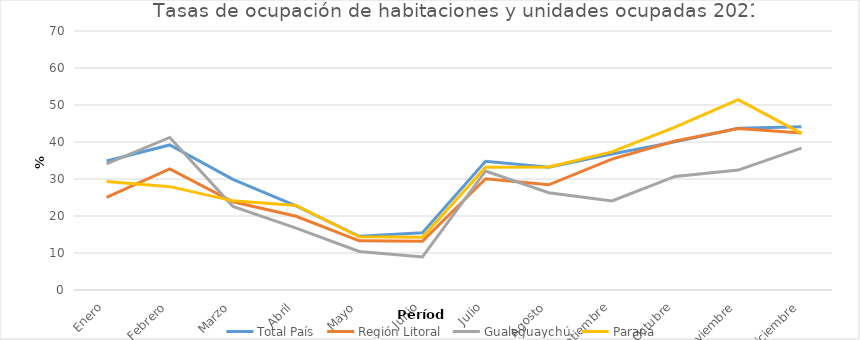
| Category | Total País | Región Litoral | Gualeguaychú | Paraná |
|---|---|---|---|---|
| Enero | 34.859 | 25.038 | 34.062 | 29.308 |
| Febrero | 39.201 | 32.708 | 41.226 | 27.935 |
| Marzo | 29.902 | 23.837 | 22.61 | 24.097 |
| Abril | 22.762 | 19.927 | 16.72 | 22.861 |
| Mayo | 14.509 | 13.28 | 10.406 | 14.374 |
| Junio | 15.469 | 13.162 | 8.916 | 14.261 |
| Julio | 34.796 | 30.067 | 32.172 | 33.179 |
| Agosto | 33.19 | 28.424 | 26.273 | 33.252 |
| Septiembre | 36.761 | 35.392 | 24.077 | 37.342 |
| Octubre | 40.033 | 40.249 | 30.697 | 44.012 |
| Noviembre | 43.723 | 43.643 | 32.417 | 51.442 |
| Diciembre | 44.098 | 42.405 | 38.336 | 42.337 |